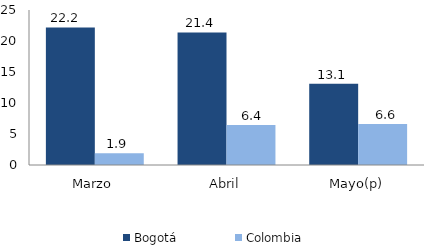
| Category | Bogotá | Colombia |
|---|---|---|
| Marzo | 22.19 | 1.896 |
| Abril | 21.38 | 6.436 |
| Mayo(p) | 13.113 | 6.619 |